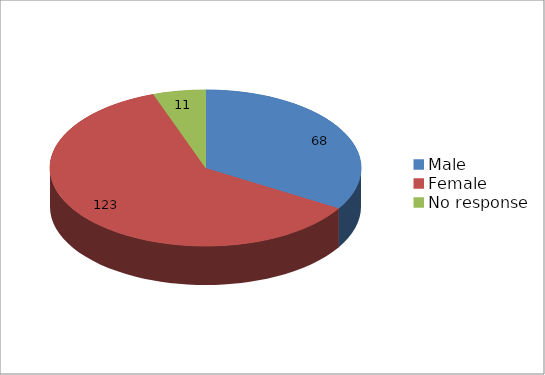
| Category | Series 0 |
|---|---|
| Male | 68 |
| Female  | 123 |
| No response  | 11 |